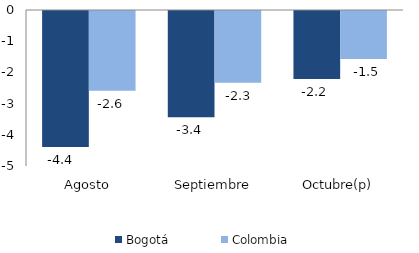
| Category | Bogotá | Colombia |
|---|---|---|
| Agosto | -4.358 | -2.559 |
| Septiembre | -3.402 | -2.302 |
| Octubre(p) | -2.179 | -1.542 |